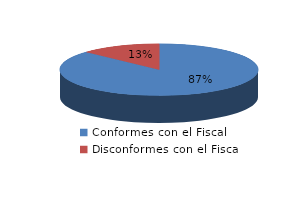
| Category | Series 0 |
|---|---|
| 0 | 2198 |
| 1 | 330 |